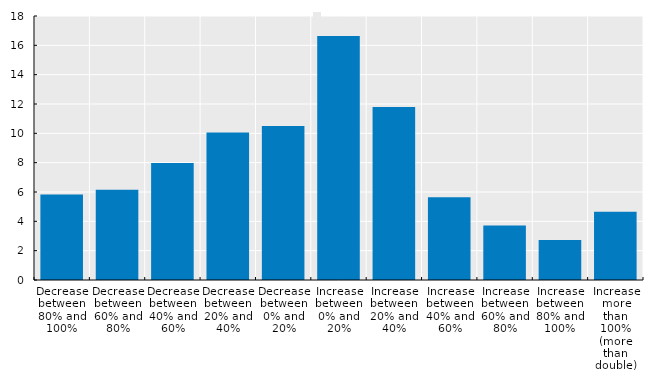
| Category | Frequency (%) |
|---|---|
| Decrease between 80% and 100% | 5.838 |
| Decrease between 60% and 80% | 6.161 |
| Decrease between 40% and 60% | 7.982 |
| Decrease between 20% and 40% | 10.056 |
| Decrease between 0% and 20% | 10.493 |
| Increase between 0% and 20% | 16.628 |
| Increase between 20% and 40% | 11.796 |
| Increase between 40% and 60% | 5.64 |
| Increase between 60% and 80% | 3.716 |
| Increase between 80% and 100% | 2.734 |
| Increase more than 100% (more than double) | 4.647 |